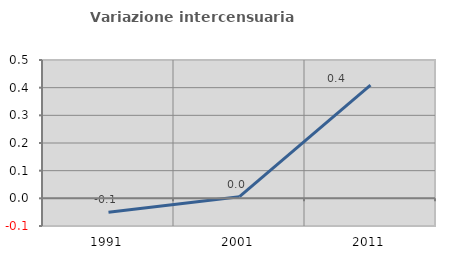
| Category | Variazione intercensuaria annua |
|---|---|
| 1991.0 | -0.051 |
| 2001.0 | 0.006 |
| 2011.0 | 0.41 |